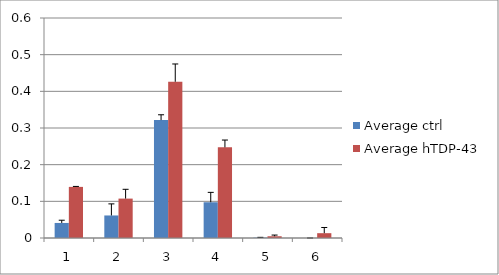
| Category | Average ctrl | Average hTDP-43 |
|---|---|---|
| 0 | 0.041 | 0.139 |
| 1 | 0.061 | 0.107 |
| 2 | 0.322 | 0.426 |
| 3 | 0.098 | 0.247 |
| 4 | 0.001 | 0.005 |
| 5 | 0 | 0.013 |